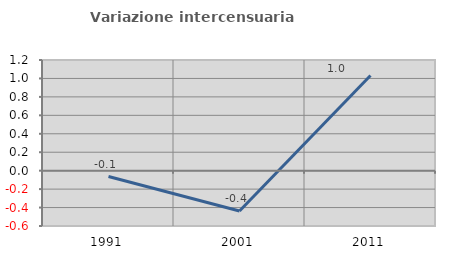
| Category | Variazione intercensuaria annua |
|---|---|
| 1991.0 | -0.064 |
| 2001.0 | -0.437 |
| 2011.0 | 1.032 |